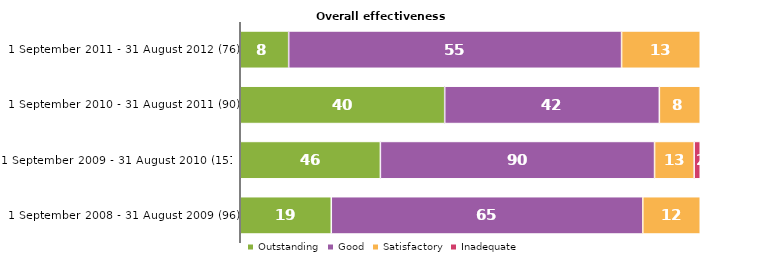
| Category | Outstanding | Good | Satisfactory | Inadequate |
|---|---|---|---|---|
| 1 September 2011 - 31 August 2012 (76) | 8 | 55 | 13 | 0 |
| 1 September 2010 - 31 August 2011 (90) | 40 | 42 | 8 | 0 |
| 1 September 2009 - 31 August 2010 (151) | 46 | 90 | 13 | 2 |
| 1 September 2008 - 31 August 2009 (96) | 19 | 65 | 12 | 0 |